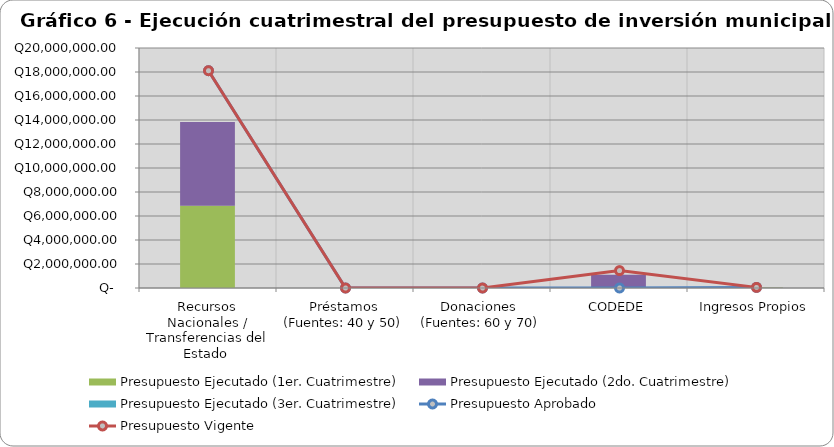
| Category | Presupuesto Ejecutado (1er. Cuatrimestre) | Presupuesto Ejecutado (2do. Cuatrimestre) | Presupuesto Ejecutado (3er. Cuatrimestre) |
|---|---|---|---|
| Recursos Nacionales / Transferencias del Estado  | 6864273.19 | 6977957.83 | 0 |
| Préstamos (Fuentes: 40 y 50) | 0 | 0 | 0 |
| Donaciones  (Fuentes: 60 y 70) | 0 | 0 | 0 |
| CODEDE | 28960.4 | 1066018 | 0 |
| Ingresos Propios | 37757.04 | 19714.81 | 0 |